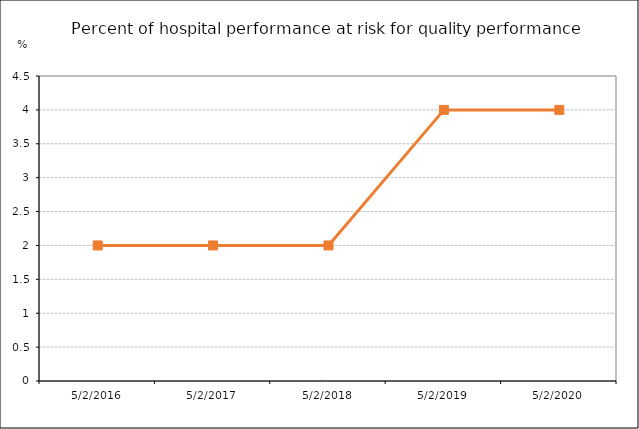
| Category | Values | Date / Observation | Goal |
|---|---|---|---|
| 5/2/16 |  |  | 2 |
| 5/2/17 |  |  | 2 |
| 5/2/18 |  |  | 2 |
| 5/2/19 |  |  | 4 |
| 5/2/20 |  |  | 4 |